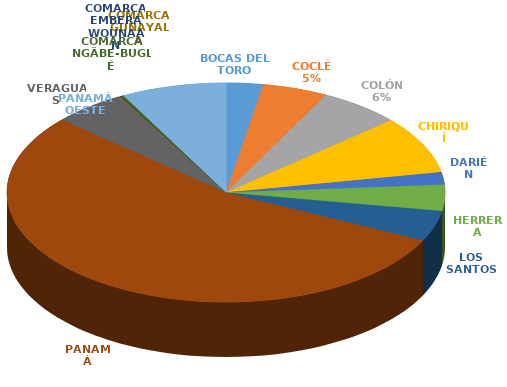
| Category | Cantidad  |
|---|---|
| BOCAS DEL TORO | 171 |
| COCLÉ | 303 |
| COLÓN | 380 |
| CHIRIQUÍ | 532 |
| DARIÉN | 116 |
| HERRERA | 245 |
| LOS SANTOS | 284 |
| PANAMÁ | 3425 |
| VERAGUAS | 335 |
| COMARCA GUNAYALA | 6 |
| COMARCA EMBERÁ WOUNAAN | 5 |
| COMARCA NGÄBE-BUGLÉ | 14 |
| PANAMÁ OESTE | 488 |